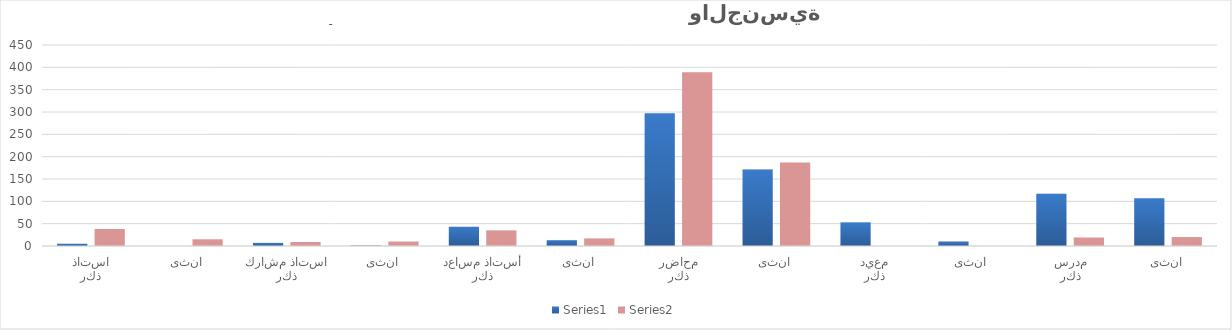
| Category | Series 0 | Series 1 |
|---|---|---|
| 0 | 5 | 38 |
| 1 | 0 | 15 |
| 2 | 7 | 9 |
| 3 | 1 | 10 |
| 4 | 43 | 35 |
| 5 | 13 | 17 |
| 6 | 297 | 389 |
| 7 | 171 | 187 |
| 8 | 53 | 0 |
| 9 | 10 | 0 |
| 10 | 117 | 19 |
| 11 | 107 | 20 |